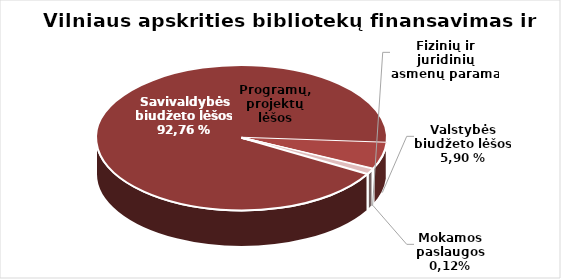
| Category | Series 0 |
|---|---|
| Savivaldybės biudžeto lėšos | 8582504 |
| Valstybės biudžeto lėšos | 545968 |
| Mokamos paslaugos | 11219.15 |
| Fizinių ir juridinių asmenų parama | 4540.07 |
| Programų, projektų lėšos | 107533.09 |